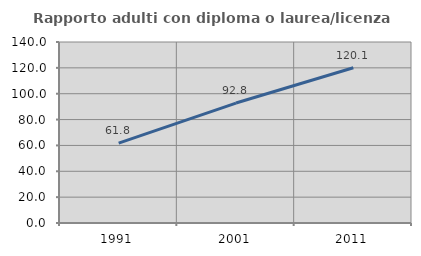
| Category | Rapporto adulti con diploma o laurea/licenza media  |
|---|---|
| 1991.0 | 61.8 |
| 2001.0 | 92.779 |
| 2011.0 | 120.126 |